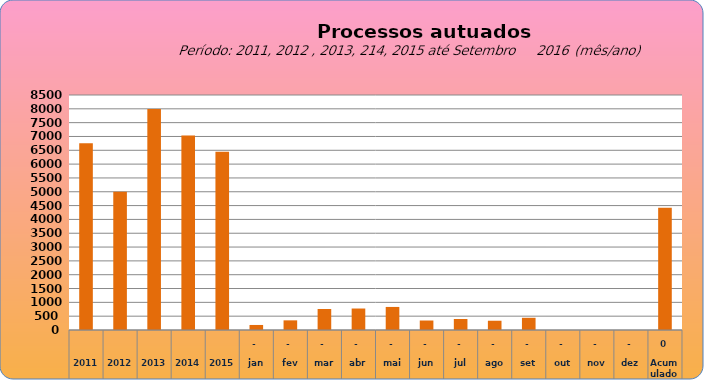
| Category | 6755 |
|---|---|
| 2011 | 6755 |
| 2012 | 4997 |
| 2013 | 7990 |
| 2014 | 7034 |
| 2015 | 6446 |
| jan | 182 |
| fev | 349 |
| mar | 760 |
| abr | 777 |
| mai | 834 |
| jun | 343 |
| jul | 397 |
| ago | 335 |
| set | 441 |
| out | 0 |
| nov | 0 |
| dez | 0 |
| Acumulado
 | 4418 |